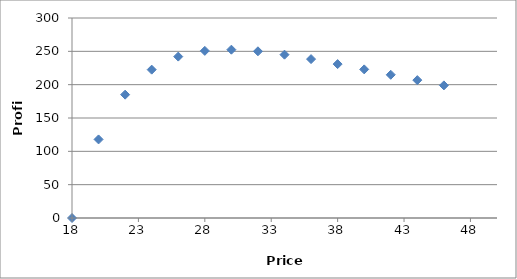
| Category | Series 0 |
|---|---|
| 18.0 | 0 |
| 20.0 | 117.86 |
| 22.0 | 185.037 |
| 24.0 | 222.519 |
| 26.0 | 242.108 |
| 28.0 | 250.709 |
| 30.0 | 252.49 |
| 32.0 | 250.034 |
| 34.0 | 244.971 |
| 36.0 | 238.35 |
| 38.0 | 230.851 |
| 40.0 | 222.916 |
| 42.0 | 214.837 |
| 44.0 | 206.802 |
| 46.0 | 198.932 |